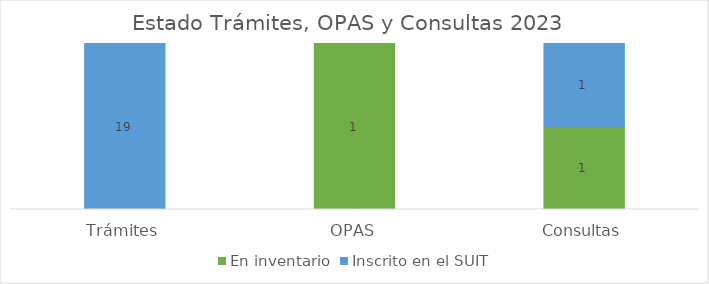
| Category | En inventario | Inscrito en el SUIT |
|---|---|---|
| Trámites | 0 | 19 |
| OPAS | 1 | 0 |
| Consultas | 1 | 1 |